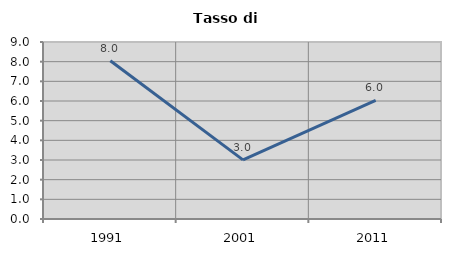
| Category | Tasso di disoccupazione   |
|---|---|
| 1991.0 | 8.049 |
| 2001.0 | 3.008 |
| 2011.0 | 6.032 |